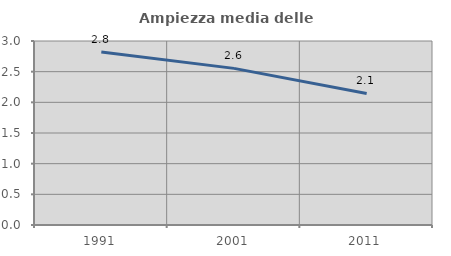
| Category | Ampiezza media delle famiglie |
|---|---|
| 1991.0 | 2.822 |
| 2001.0 | 2.554 |
| 2011.0 | 2.144 |